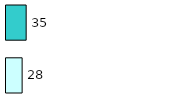
| Category | Series 0 | Series 1 |
|---|---|---|
| 0 | 28 | 35 |